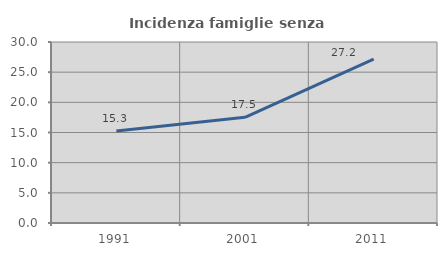
| Category | Incidenza famiglie senza nuclei |
|---|---|
| 1991.0 | 15.254 |
| 2001.0 | 17.508 |
| 2011.0 | 27.172 |